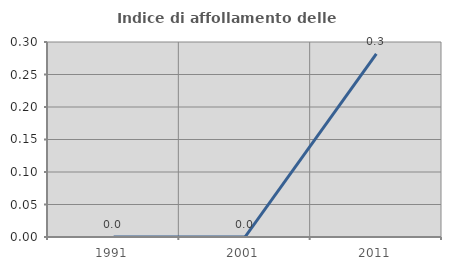
| Category | Indice di affollamento delle abitazioni  |
|---|---|
| 1991.0 | 0 |
| 2001.0 | 0 |
| 2011.0 | 0.282 |